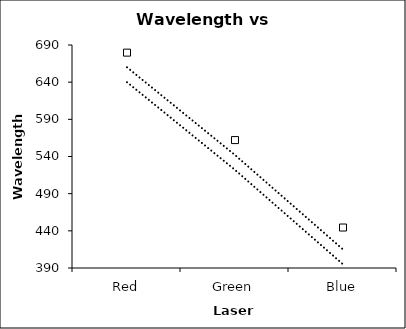
| Category | Wavelength (nm) | Upper | Lower |
|---|---|---|---|
| Red | 679.739 | 640 | 660 |
| Green | 562.092 | 522 | 542 |
| Blue | 444.444 | 395 | 415 |